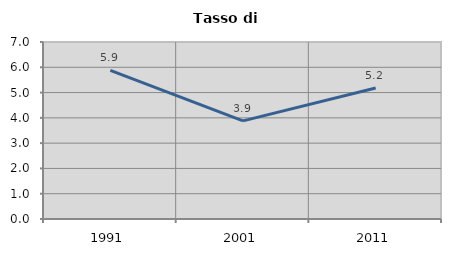
| Category | Tasso di disoccupazione   |
|---|---|
| 1991.0 | 5.878 |
| 2001.0 | 3.881 |
| 2011.0 | 5.183 |